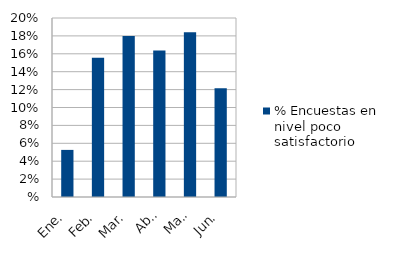
| Category | % Encuestas en nivel poco satisfactorio |
|---|---|
| Ene. | 0.053 |
| Feb. | 0.156 |
| Mar. | 0.18 |
| Abr. | 0.164 |
| May. | 0.184 |
| Jun. | 0.122 |